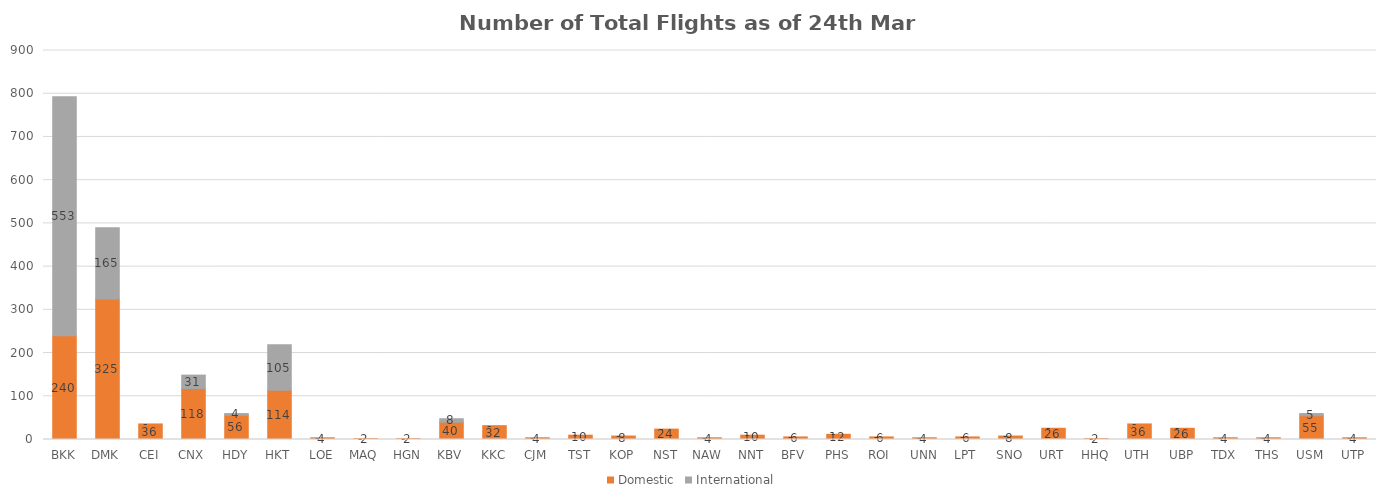
| Category | Domestic | International |
|---|---|---|
| BKK | 240 | 553 |
| DMK | 325 | 165 |
| CEI | 36 | 0 |
| CNX | 118 | 31 |
| HDY | 56 | 4 |
| HKT | 114 | 105 |
| LOE | 4 | 0 |
| MAQ | 2 | 0 |
| HGN | 2 | 0 |
| KBV | 40 | 8 |
| KKC | 32 | 0 |
| CJM | 4 | 0 |
| TST | 10 | 0 |
| KOP | 8 | 0 |
| NST | 24 | 0 |
| NAW | 4 | 0 |
| NNT | 10 | 0 |
| BFV | 6 | 0 |
| PHS | 12 | 0 |
| ROI | 6 | 0 |
| UNN | 4 | 0 |
| LPT | 6 | 0 |
| SNO | 8 | 0 |
| URT | 26 | 0 |
| HHQ | 2 | 0 |
| UTH | 36 | 0 |
| UBP | 26 | 0 |
| TDX | 4 | 0 |
| THS | 4 | 0 |
| USM | 55 | 5 |
| UTP | 4 | 0 |